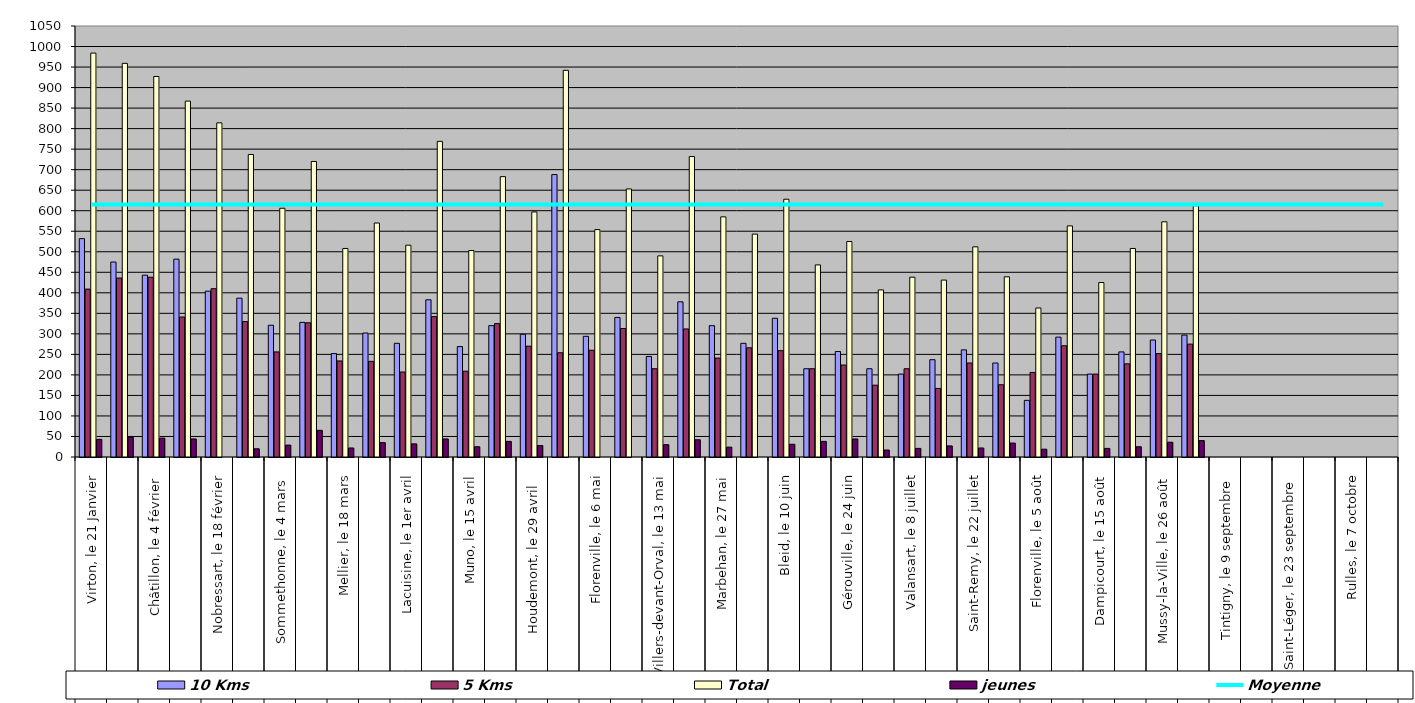
| Category | 10 Kms | 5 Kms | Total | jeunes |
|---|---|---|---|---|
| 0 | 532 | 409 | 984 | 43 |
| 1 | 475 | 436 | 959 | 48 |
| 2 | 443 | 438 | 927 | 46 |
| 3 | 482 | 341 | 867 | 44 |
| 4 | 404 | 410 | 814 | 0 |
| 5 | 387 | 330 | 737 | 20 |
| 6 | 321 | 256 | 606 | 29 |
| 7 | 328 | 327 | 720 | 65 |
| 8 | 252 | 234 | 508 | 22 |
| 9 | 302 | 233 | 570 | 35 |
| 10 | 277 | 207 | 516 | 32 |
| 11 | 383 | 342 | 769 | 44 |
| 12 | 269 | 209 | 503 | 25 |
| 13 | 320 | 325 | 683 | 38 |
| 14 | 299 | 270 | 597 | 28 |
| 15 | 688 | 254 | 942 | 0 |
| 16 | 294 | 260 | 554 | 0 |
| 17 | 340 | 313 | 653 | 0 |
| 18 | 245 | 215 | 490 | 30 |
| 19 | 378 | 312 | 732 | 42 |
| 20 | 320 | 241 | 585 | 24 |
| 21 | 277 | 266 | 543 | 0 |
| 22 | 338 | 259 | 628 | 31 |
| 23 | 215 | 215 | 468 | 38 |
| 24 | 257 | 224 | 525 | 44 |
| 25 | 215 | 175 | 407 | 17 |
| 26 | 202 | 215 | 438 | 21 |
| 27 | 237 | 167 | 431 | 27 |
| 28 | 261 | 229 | 512 | 22 |
| 29 | 229 | 176 | 439 | 34 |
| 30 | 138 | 206 | 363 | 19 |
| 31 | 292 | 271 | 563 | 0 |
| 32 | 202 | 202 | 425 | 21 |
| 33 | 256 | 227 | 508 | 25 |
| 34 | 285 | 252 | 573 | 36 |
| 35 | 297 | 275 | 612 | 40 |
| 36 | 0 | 0 | 0 | 0 |
| 37 | 0 | 0 | 0 | 0 |
| 38 | 0 | 0 | 0 | 0 |
| 39 | 0 | 0 | 0 | 0 |
| 40 | 0 | 0 | 0 | 0 |
| 41 | 0 | 0 | 0 | 0 |